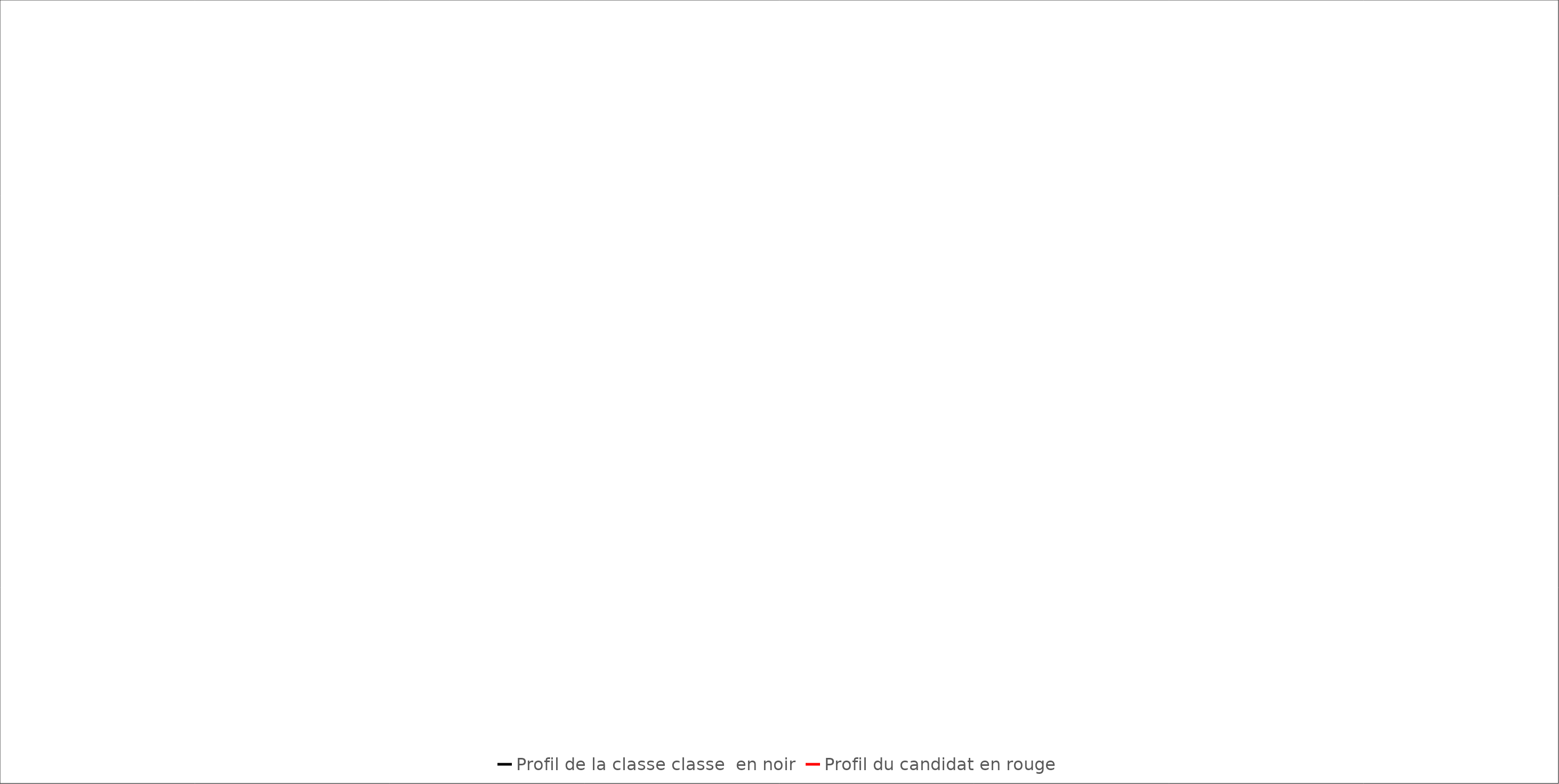
| Category | Profil de la classe classe  en noir | Profil du candidat en rouge |
|---|---|---|
| Communication et expression française | 0 | 0 |
| Langue vivante étrangère A | 0 | 0 |
| Langue vivante étrangère B | 0 | 0 |
| Entrepreneuriat et pilotage de l’entreprise hôtelière (EPEH) | 0 | 0 |
| Management de l’entreprise hôtelière et mercatique des services (MEHMS) | 0 | 0 |
| Sciences en hôtellerie restauration (SHR) Uniquement 1ère année | 0 | 0 |
| Ingénierie en hôtellerie restauration (IHR) Uniquement 1ère année | 0 | 0 |
| Sciences et technologies culinaires (STC) Uniquement 1ère année | 0 | 0 |
| Sciences et technologies des services en hébergement (STSH)   Uniquement 1ère année | 0 | 0 |
| Sciences et technologies des services en restauration (STSR)          1ère et 2ème Année | 0 | 0 |
| Enseignements spécifiques: Sommellerie et tech. de bar              Uniquement 2ème Année  | 0 | 0 |
| Conduite du projet entrepreneurial 
Uniquement 2ème Année  | 0 | 0 |
| Enseignement facultatif : Langue Vivante C | 0 | 0 |
| Epreuve facultative: engagement étudiant | 0 | 0 |